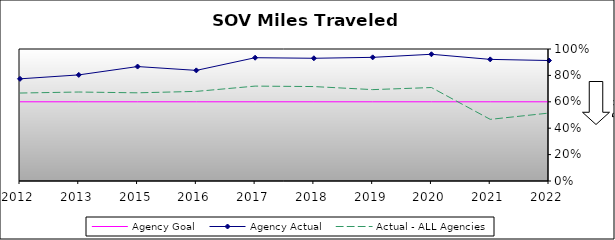
| Category | Agency Goal | Agency Actual | Actual - ALL Agencies |
|---|---|---|---|
| 2012.0 | 0.6 | 0.774 | 0.666 |
| 2013.0 | 0.6 | 0.804 | 0.674 |
| 2015.0 | 0.6 | 0.867 | 0.668 |
| 2016.0 | 0.6 | 0.838 | 0.679 |
| 2017.0 | 0.6 | 0.934 | 0.719 |
| 2018.0 | 0.6 | 0.93 | 0.715 |
| 2019.0 | 0.6 | 0.937 | 0.692 |
| 2020.0 | 0.6 | 0.96 | 0.708 |
| 2021.0 | 0.6 | 0.921 | 0.467 |
| 2022.0 | 0.6 | 0.913 | 0.515 |